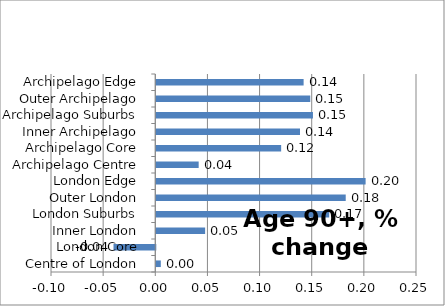
| Category | Series 0 |
|---|---|
| Centre of London | 0.004 |
| London Core | -0.04 |
| Inner London | 0.047 |
| London Suburbs | 0.166 |
| Outer London | 0.182 |
| London Edge | 0.201 |
| Archipelago Centre | 0.041 |
| Archipelago Core | 0.12 |
| Inner Archipelago | 0.138 |
| Archipelago Suburbs | 0.15 |
| Outer Archipelago | 0.148 |
| Archipelago Edge | 0.141 |